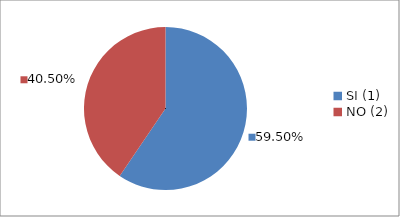
| Category | Series 0 |
|---|---|
| SI (1) | 0.595 |
| NO (2) | 0.405 |